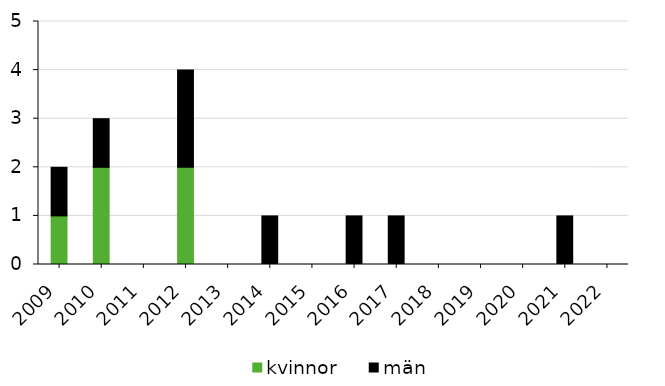
| Category | kvinnor | män |
|---|---|---|
| 2009 | 1 | 1 |
| 2010 | 2 | 1 |
| 2011 | 0 | 0 |
| 2012 | 2 | 2 |
| 2013 | 0 | 0 |
| 2014 | 0 | 1 |
| 2015 | 0 | 0 |
| 2016 | 0 | 1 |
| 2017 | 0 | 1 |
| 2018 | 0 | 0 |
| 2019 | 0 | 0 |
| 2020 | 0 | 0 |
| 2021 | 0 | 1 |
| 2022 | 0 | 0 |